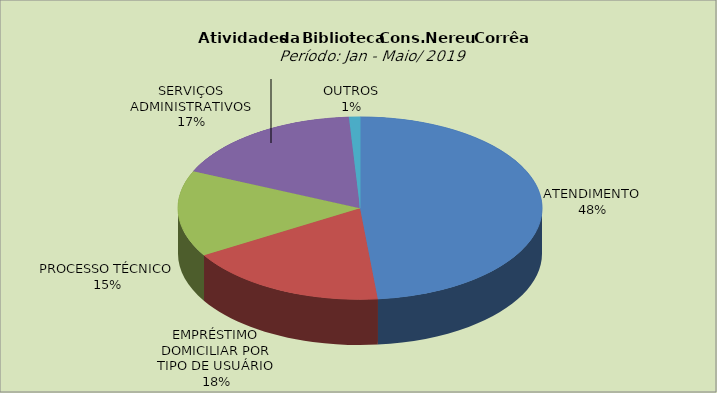
| Category | Series 0 |
|---|---|
| ATENDIMENTO | 48.447 |
| EMPRÉSTIMO DOMICILIAR POR TIPO DE USUÁRIO | 17.919 |
| PROCESSO TÉCNICO | 15.249 |
| SERVIÇOS ADMINISTRATIVOS | 17.411 |
| OUTROS | 0.975 |